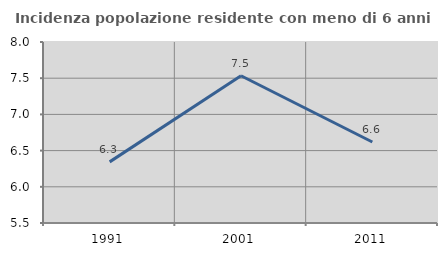
| Category | Incidenza popolazione residente con meno di 6 anni |
|---|---|
| 1991.0 | 6.344 |
| 2001.0 | 7.534 |
| 2011.0 | 6.619 |